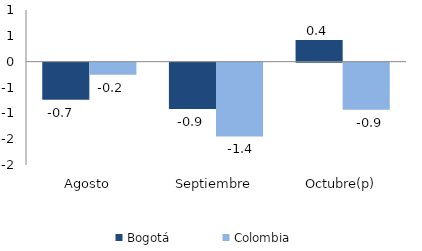
| Category | Bogotá | Colombia |
|---|---|---|
| Agosto | -0.715 | -0.236 |
| Septiembre | -0.895 | -1.427 |
| Octubre(p) | 0.418 | -0.911 |